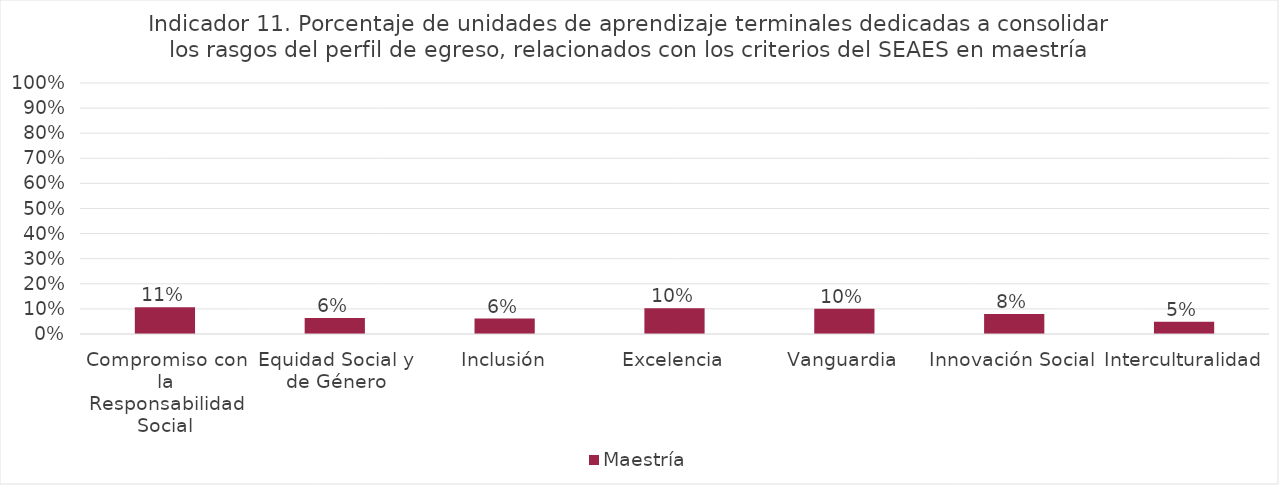
| Category | Maestría |
|---|---|
| Compromiso con la Responsabilidad Social | 0.107 |
| Equidad Social y de Género | 0.064 |
| Inclusión | 0.062 |
| Excelencia | 0.103 |
| Vanguardia | 0.101 |
| Innovación Social | 0.08 |
| Interculturalidad | 0.049 |